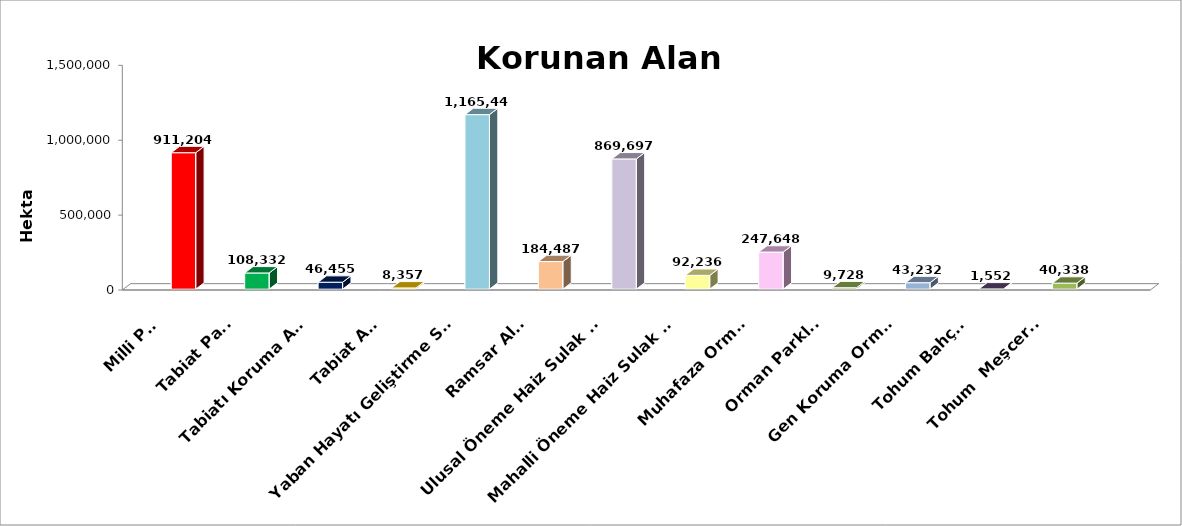
| Category | Series 0 | Series 1 | Series 2 |
|---|---|---|---|
| Milli Park |  |  | 911204 |
| Tabiat Parkı |  |  | 108332 |
| Tabiatı Koruma Alanı |  |  | 46455 |
| Tabiat Anıtı |  |  | 8357 |
| Yaban Hayatı Geliştirme Sahası |  |  | 1165448 |
| Ramsar Alanı |  |  | 184487 |
| Ulusal Öneme Haiz Sulak Alan |  |  | 869697 |
| Mahalli Öneme Haiz Sulak Alan |  |  | 92236 |
| Muhafaza Ormanı |  |  | 247648 |
| Orman Parkları |  |  | 9728 |
| Gen Koruma Ormanı |  |  | 43232 |
| Tohum Bahçesi |  |  | 1552 |
| Tohum  Meşceresi |  |  | 40338 |